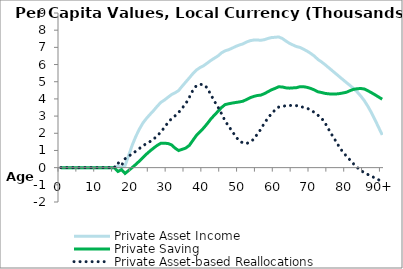
| Category | Private Asset Income | Private Saving | Private Asset-based Reallocations |
|---|---|---|---|
| 0 | 0 | 0 | 0 |
|  | 0 | 0 | 0 |
| 2 | 0 | 0 | 0 |
| 3 | 0 | 0 | 0 |
| 4 | 0 | 0 | 0 |
| 5 | 0 | 0 | 0 |
| 6 | 0 | 0 | 0 |
| 7 | 0 | 0 | 0 |
| 8 | 0 | 0 | 0 |
| 9 | 0 | 0 | 0 |
| 10 | 0 | 0 | 0 |
| 11 | 0 | 0 | 0 |
| 12 | 0 | 0 | 0 |
| 13 | 0 | 0 | 0 |
| 14 | 0 | 0 | 0 |
| 15 | 0 | 0 | 0 |
| 16 | 86.008 | -223.394 | 290.549 |
| 17 | 5.903 | -114.9 | 113.154 |
| 18 | 112.854 | -336.892 | 517.653 |
| 19 | 709.824 | -165.641 | 662.962 |
| 20 | 1306.794 | 5.611 | 808.272 |
| 21 | 1812.856 | 187.687 | 953.937 |
| 22 | 2238.485 | 380.103 | 1112.693 |
| 23 | 2600.541 | 581.308 | 1274.5 |
| 24 | 2866.512 | 788.931 | 1395.18 |
| 25 | 3101.61 | 972.784 | 1519.117 |
| 26 | 3325.822 | 1139.844 | 1659.982 |
| 27 | 3570.305 | 1295.367 | 1853.624 |
| 28 | 3795.841 | 1415.458 | 2065.239 |
| 29 | 3931.194 | 1418.728 | 2338.011 |
| 30 | 4092.786 | 1406.412 | 2618.821 |
| 31 | 4250.029 | 1325.372 | 2846.812 |
| 32 | 4355.164 | 1134.857 | 3014.086 |
| 33 | 4487.398 | 994.926 | 3210.982 |
| 34 | 4743.658 | 1065.757 | 3466.63 |
| 35 | 4984.721 | 1139.405 | 3721.758 |
| 36 | 5226.027 | 1295.51 | 4095.926 |
| 37 | 5474.149 | 1592.132 | 4504.655 |
| 38 | 5683.955 | 1881.893 | 4779.586 |
| 39 | 5825.487 | 2085.409 | 4843.796 |
| 40 | 5932.341 | 2309.491 | 4836.263 |
| 41 | 6082.227 | 2555.947 | 4641.111 |
| 42 | 6235.799 | 2827.718 | 4253.109 |
| 43 | 6368.677 | 3054.478 | 3866.495 |
| 44 | 6499.413 | 3273.372 | 3534.504 |
| 45 | 6678.577 | 3496.423 | 3143.19 |
| 46 | 6798.382 | 3668.722 | 2724.398 |
| 47 | 6862.348 | 3717.668 | 2411.026 |
| 48 | 6955.284 | 3758.685 | 2109.202 |
| 49 | 7056.344 | 3792.428 | 1811.754 |
| 50 | 7136.752 | 3823.315 | 1545.244 |
| 51 | 7202.525 | 3866.552 | 1443.593 |
| 52 | 7310.034 | 3960.876 | 1401.296 |
| 53 | 7387.54 | 4068.669 | 1489.274 |
| 54 | 7425.409 | 4143.005 | 1650.953 |
| 55 | 7429.907 | 4196.902 | 1944.078 |
| 56 | 7411.588 | 4220.825 | 2231.622 |
| 57 | 7448.536 | 4305.931 | 2591.278 |
| 58 | 7518.126 | 4417.884 | 2877.112 |
| 59 | 7570.223 | 4528.745 | 3148.048 |
| 60 | 7586.214 | 4611.648 | 3355.798 |
| 61 | 7606.343 | 4704.634 | 3522.767 |
| 62 | 7521.388 | 4696.647 | 3562.27 |
| 63 | 7374.078 | 4644.78 | 3605.653 |
| 64 | 7237.049 | 4626.161 | 3618.869 |
| 65 | 7139.475 | 4640.471 | 3619.886 |
| 66 | 7044.947 | 4655.364 | 3606.69 |
| 67 | 6996.109 | 4710.526 | 3571.431 |
| 68 | 6888.645 | 4708.981 | 3500.605 |
| 69 | 6778.615 | 4671.346 | 3449.425 |
| 70 | 6644.543 | 4607.726 | 3359.843 |
| 71 | 6491.505 | 4522.802 | 3208.219 |
| 72 | 6295.545 | 4415.499 | 3049.595 |
| 73 | 6155.072 | 4371.994 | 2878.824 |
| 74 | 5993.948 | 4321.662 | 2599.14 |
| 75 | 5819.355 | 4294.163 | 2231.919 |
| 76 | 5644.761 | 4286.453 | 1876.044 |
| 77 | 5470.168 | 4285.186 | 1545.353 |
| 78 | 5295.575 | 4308.033 | 1201.461 |
| 79 | 5120.982 | 4345.666 | 899.977 |
| 80 | 4947.152 | 4389.566 | 668.365 |
| 81 | 4781.216 | 4481.496 | 442.581 |
| 82 | 4601.587 | 4558.11 | 212.967 |
| 83 | 4399.637 | 4593.169 | 6.358 |
| 84 | 4166.735 | 4604.904 | -165.245 |
| 85 | 3893.49 | 4576.674 | -296.259 |
| 86 | 3564.139 | 4473 | -399.026 |
| 87 | 3191.64 | 4359.874 | -499.114 |
| 88 | 2775.992 | 4237.295 | -603.296 |
| 89 | 2338.769 | 4109.99 | -710.583 |
| 90+ | 1901.547 | 3982.685 | -817.87 |